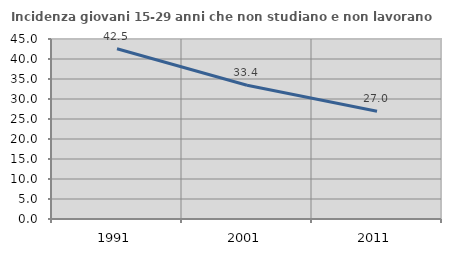
| Category | Incidenza giovani 15-29 anni che non studiano e non lavorano  |
|---|---|
| 1991.0 | 42.549 |
| 2001.0 | 33.442 |
| 2011.0 | 26.957 |